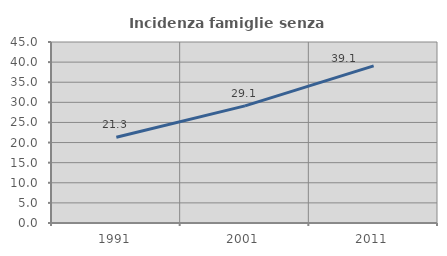
| Category | Incidenza famiglie senza nuclei |
|---|---|
| 1991.0 | 21.335 |
| 2001.0 | 29.12 |
| 2011.0 | 39.055 |